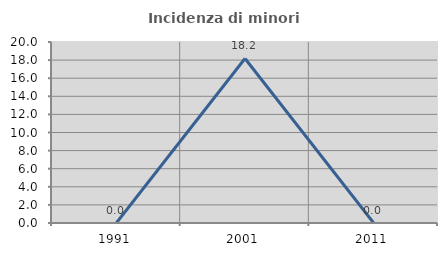
| Category | Incidenza di minori stranieri |
|---|---|
| 1991.0 | 0 |
| 2001.0 | 18.182 |
| 2011.0 | 0 |